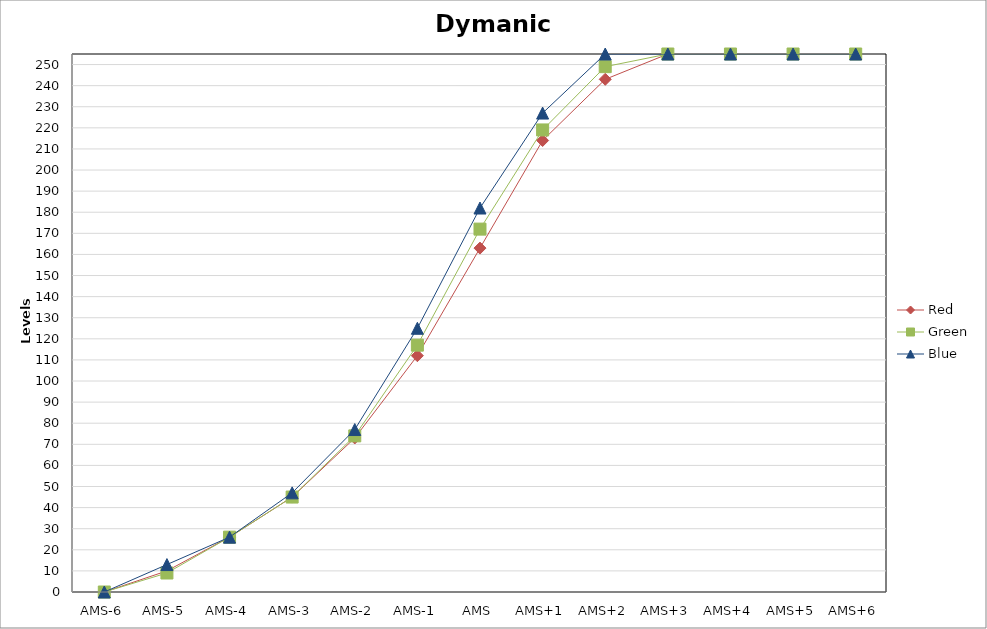
| Category | Red | Green | Blue |
|---|---|---|---|
| AMS-6 | 0 | 0 | 0 |
| AMS-5 | 10 | 9 | 13 |
| AMS-4 | 26 | 26 | 26 |
| AMS-3 | 45 | 45 | 47 |
| AMS-2 | 73 | 74 | 77 |
| AMS-1 | 112 | 117 | 125 |
| AMS | 163 | 172 | 182 |
| AMS+1 | 214 | 219 | 227 |
| AMS+2 | 243 | 249 | 255 |
| AMS+3 | 255 | 255 | 255 |
| AMS+4 | 255 | 255 | 255 |
| AMS+5 | 255 | 255 | 255 |
| AMS+6 | 255 | 255 | 255 |